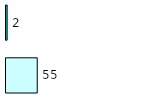
| Category | Series 0 | Series 1 |
|---|---|---|
| 0 | 55 | 2 |